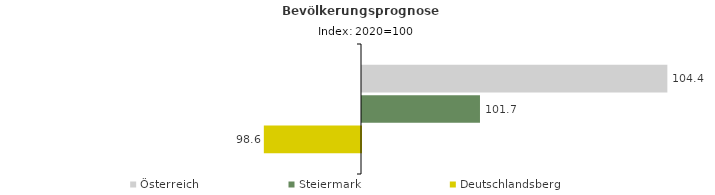
| Category | Österreich | Steiermark | Deutschlandsberg |
|---|---|---|---|
| 2020.0 | 104.4 | 101.7 | 98.6 |